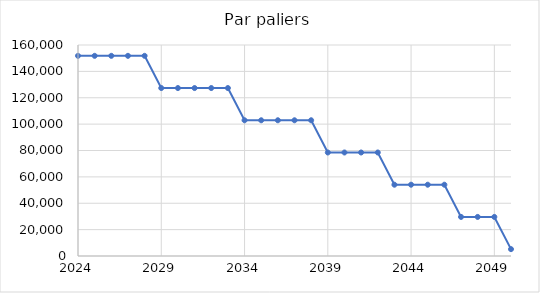
| Category | Emissions (t eqCO2) |
|---|---|
| 2024.0 | 151788 |
| 2025.0 | 151788 |
| 2026.0 | 151788 |
| 2027.0 | 151788 |
| 2028.0 | 151788 |
| 2029.0 | 127356.667 |
| 2030.0 | 127356.667 |
| 2031.0 | 127356.667 |
| 2032.0 | 127356.667 |
| 2033.0 | 127356.667 |
| 2034.0 | 102925.333 |
| 2035.0 | 102925.333 |
| 2036.0 | 102925.333 |
| 2037.0 | 102925.333 |
| 2038.0 | 102925.333 |
| 2039.0 | 78494 |
| 2040.0 | 78494 |
| 2041.0 | 78494 |
| 2042.0 | 78494 |
| 2043.0 | 54062.667 |
| 2044.0 | 54062.667 |
| 2045.0 | 54062.667 |
| 2046.0 | 54062.667 |
| 2047.0 | 29631.333 |
| 2048.0 | 29631.333 |
| 2049.0 | 29631.333 |
| 2050.0 | 5200 |